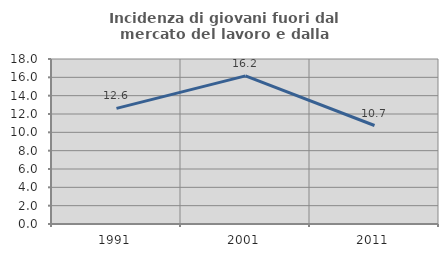
| Category | Incidenza di giovani fuori dal mercato del lavoro e dalla formazione  |
|---|---|
| 1991.0 | 12.613 |
| 2001.0 | 16.162 |
| 2011.0 | 10.744 |